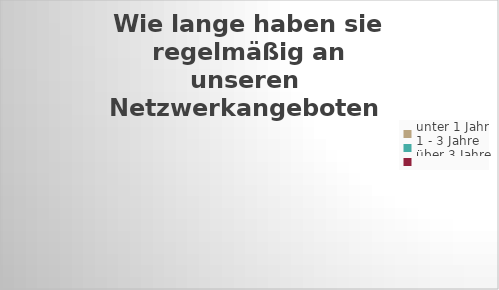
| Category | Wie lange haben sie regelmäßig an unseren  Netzwerkangeboten 
teilgenommen? |
|---|---|
| unter 1 Jahr | 0 |
| 1 - 3 Jahre | 0 |
| über 3 Jahre | 0 |